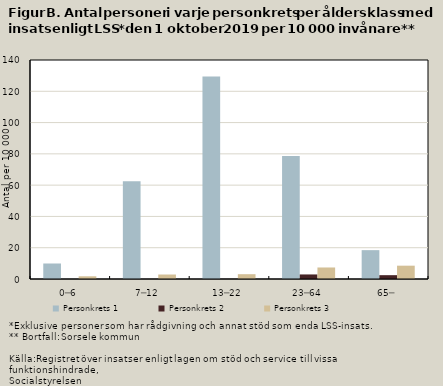
| Category | Personkrets 1 | Personkrets 2 | Personkrets 3 |
|---|---|---|---|
| 0─6 | 9.91 | 0.024 | 1.73 |
| 7─12 | 62.423 | 0.027 | 2.868 |
| 13─22 | 129.407 | 0.07 | 3.075 |
| 23─64 | 78.649 | 2.913 | 7.365 |
| 65─ | 18.443 | 2.448 | 8.514 |